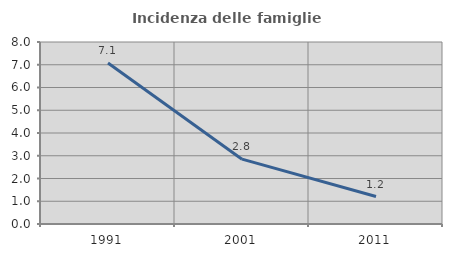
| Category | Incidenza delle famiglie numerose |
|---|---|
| 1991.0 | 7.075 |
| 2001.0 | 2.849 |
| 2011.0 | 1.208 |